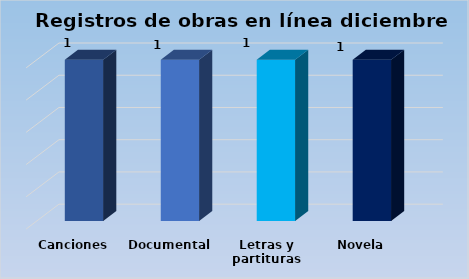
| Category | Series 0 |
|---|---|
| Canciones | 1 |
| Documental | 1 |
| Letras y partituras | 1 |
| Novela | 1 |